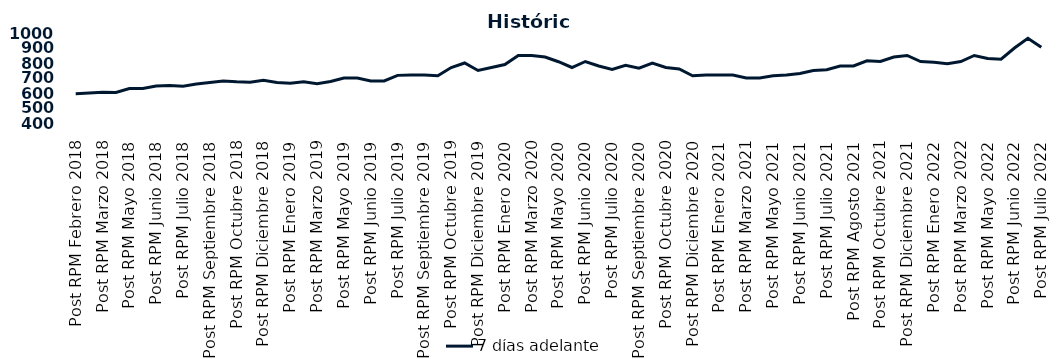
| Category | 7 días adelante  |
|---|---|
| Post RPM Febrero 2018 | 595 |
| Pre RPM Marzo 2018 | 600 |
| Post RPM Marzo 2018 | 605 |
| Pre RPM Mayo 2018 | 603 |
| Post RPM Mayo 2018 | 630 |
| Pre RPM Junio 2018 | 630 |
| Post RPM Junio 2018 | 646.5 |
| Pre RPM Julio 2018 | 650 |
| Post RPM Julio 2018 | 645 |
| Pre RPM Septiembre 2018 | 660 |
| Post RPM Septiembre 2018 | 670 |
| Pre RPM Octubre 2018 | 680 |
| Post RPM Octubre 2018 | 675 |
| Pre RPM Diciembre 2018 | 672.5 |
| Post RPM Diciembre 2018 | 685 |
| Pre RPM Enero 2019 | 670 |
| Post RPM Enero 2019 | 665 |
| Pre RPM Marzo 2019 | 675 |
| Post RPM Marzo 2019 | 661 |
| Pre RPM Mayo 2019 | 677 |
| Post RPM Mayo 2019 | 700 |
| Pre RPM Junio 2019 | 700.5 |
| Post RPM Junio 2019 | 680 |
| Pre RPM Julio 2019 | 680 |
| Post RPM Julio 2019 | 717.5 |
| Pre RPM Septiembre 2019 | 720 |
| Post RPM Septiembre 2019 | 720 |
| Pre RPM Octubre 2019 | 715 |
| Post RPM Octubre 2019 | 770 |
| Pre RPM Diciembre 2019 | 800 |
| Post RPM Diciembre 2019 | 750 |
| Pre RPM Enero 2020 | 770 |
| Post RPM Enero 2020 | 790 |
| Pre RPM Marzo 2020 | 850 |
| Post RPM Marzo 2020 | 850 |
| Pre RPM Mayo 2020 | 840 |
| Post RPM Mayo 2020 | 808.5 |
| Pre RPM Junio 2020 | 770 |
| Post RPM Junio 2020 | 810 |
| Pre RPM Julio 2020 | 780 |
| Post RPM Julio 2020 | 757 |
| Pre RPM Septiembre 2020 | 785 |
| Post RPM Septiembre 2020 | 765 |
| Pre RPM Octubre 2020 | 800 |
| Post RPM Octubre 2020 | 770 |
| Pre RPM Diciembre 2020 | 760 |
| Post RPM Diciembre 2020 | 715 |
| Pre RPM Enero 2021 | 720 |
| Post RPM Enero 2021 | 720 |
| Pre RPM Marzo 2021 | 720 |
| Post RPM Marzo 2021 | 700 |
| Pre RPM Mayo 2021 | 700 |
| Post RPM Mayo 2021 | 715 |
| Pre RPM Junio 2021 | 720 |
| Post RPM Junio 2021 | 730 |
| Pre RPM Julio 2021 | 750 |
| Post RPM Julio 2021 | 755 |
| Pre RPM Agosto 2021 | 780 |
| Post RPM Agosto 2021 | 780 |
| Pre RPM Octubre 2021 | 815 |
| Post RPM Octubre 2021 | 810 |
| Pre RPM Diciembre 2021 | 840 |
| Post RPM Diciembre 2021 | 850 |
| Pre RPM Enero 2022 | 810 |
| Post RPM Enero 2022 | 805 |
| Pre RPM Marzo 2022 | 795 |
| Post RPM Marzo 2022 | 810 |
| Pre RPM Mayo 2022 | 850 |
| Post RPM Mayo 2022 | 830 |
| Pre RPM Junio 2022 | 825 |
| Post RPM Junio 2022 | 900 |
| Pre RPM Julio 2022 | 965 |
| Post RPM Julio 2022 | 905 |